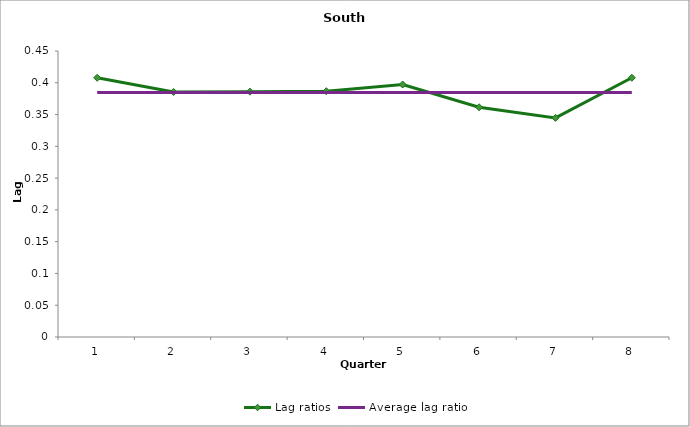
| Category | Lag ratios | Average lag ratio |
|---|---|---|
| 0 | 0.408 | 0.385 |
| 1 | 0.386 | 0.385 |
| 2 | 0.386 | 0.385 |
| 3 | 0.387 | 0.385 |
| 4 | 0.397 | 0.385 |
| 5 | 0.361 | 0.385 |
| 6 | 0.345 | 0.385 |
| 7 | 0.408 | 0.385 |